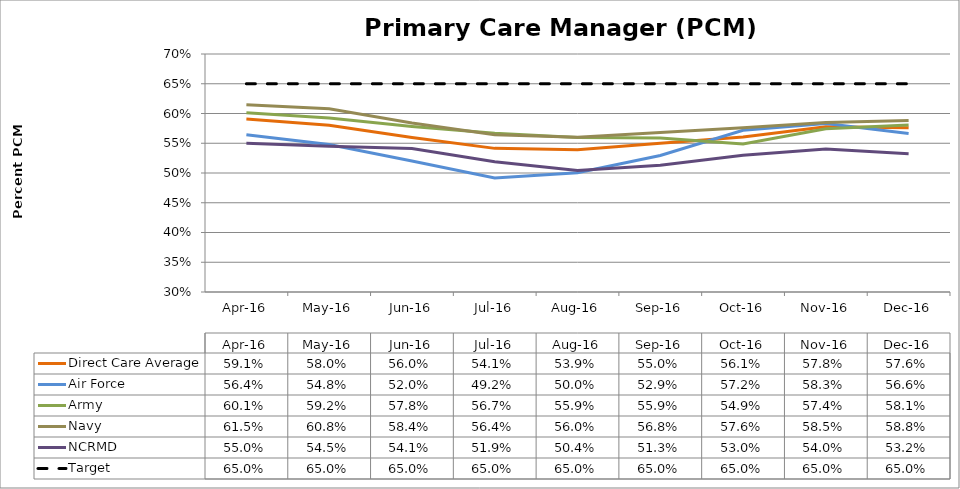
| Category | Direct Care Average | Air Force | Army | Navy | NCRMD | Target |
|---|---|---|---|---|---|---|
| 2016-04-01 | 0.591 | 0.564 | 0.601 | 0.615 | 0.55 | 0.65 |
| 2016-05-01 | 0.58 | 0.548 | 0.592 | 0.608 | 0.545 | 0.65 |
| 2016-06-01 | 0.56 | 0.52 | 0.578 | 0.584 | 0.541 | 0.65 |
| 2016-07-01 | 0.541 | 0.492 | 0.567 | 0.564 | 0.519 | 0.65 |
| 2016-08-01 | 0.539 | 0.5 | 0.559 | 0.56 | 0.504 | 0.65 |
| 2016-09-01 | 0.55 | 0.529 | 0.559 | 0.568 | 0.513 | 0.65 |
| 2016-10-01 | 0.561 | 0.572 | 0.549 | 0.576 | 0.53 | 0.65 |
| 2016-11-01 | 0.578 | 0.583 | 0.574 | 0.585 | 0.54 | 0.65 |
| 2016-12-01 | 0.576 | 0.566 | 0.581 | 0.588 | 0.532 | 0.65 |